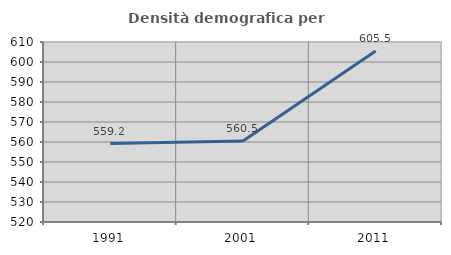
| Category | Densità demografica |
|---|---|
| 1991.0 | 559.189 |
| 2001.0 | 560.503 |
| 2011.0 | 605.497 |